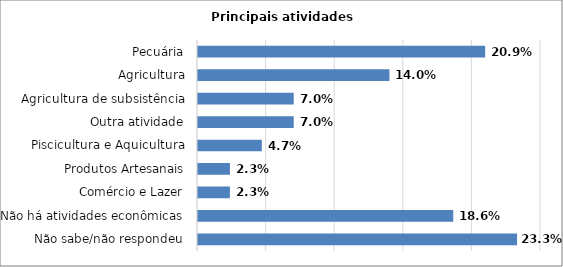
| Category | Series 0 |
|---|---|
| Não sabe/não respondeu | 0.233 |
| Não há atividades econômicas | 0.186 |
| Comércio e Lazer | 0.023 |
| Produtos Artesanais | 0.023 |
| Piscicultura e Aquicultura | 0.047 |
| Outra atividade | 0.07 |
| Agricultura de subsistência | 0.07 |
| Agricultura | 0.14 |
| Pecuária | 0.209 |